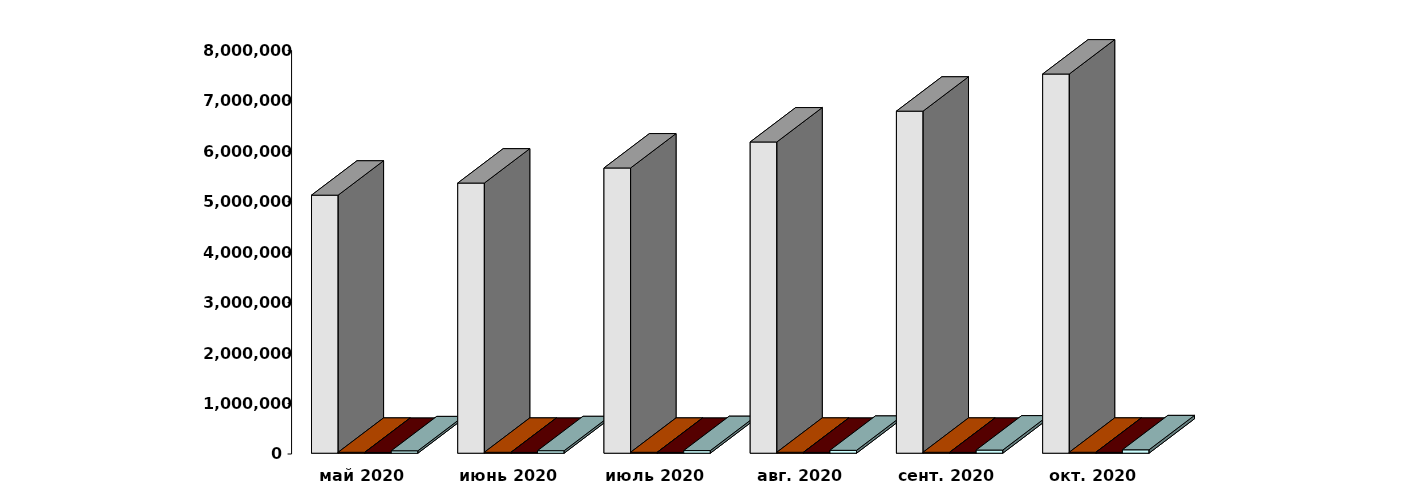
| Category | Физические лица | Юридические лица | Иностранные лица | Клиенты, передавшие свои средства в ДУ |
|---|---|---|---|---|
| 2020-05-30 | 5114736 | 18257 | 15483 | 47445 |
| 2020-06-30 | 5354906 | 18261 | 15817 | 49363 |
| 2020-07-30 | 5653690 | 18250 | 16100 | 51872 |
| 2020-08-30 | 6169141 | 18285 | 16204 | 57089 |
| 2020-09-30 | 6779757 | 18484 | 16494 | 62564 |
| 2020-10-31 | 7515934 | 18680 | 16861 | 67792 |